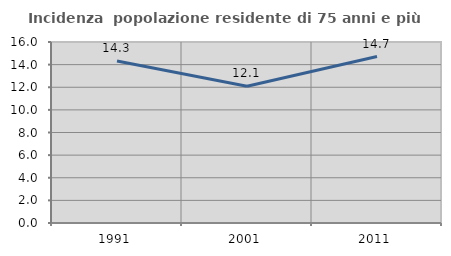
| Category | Incidenza  popolazione residente di 75 anni e più |
|---|---|
| 1991.0 | 14.314 |
| 2001.0 | 12.092 |
| 2011.0 | 14.716 |